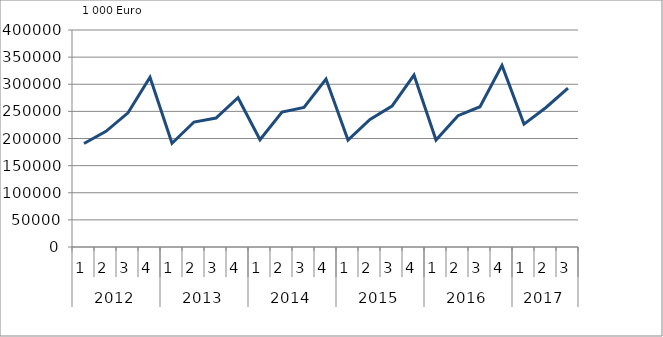
| Category | Ausbaugewerblicher Umsatz3 |
|---|---|
| 0 | 190755 |
| 1 | 213167 |
| 2 | 247277 |
| 3 | 312946 |
| 4 | 191088.978 |
| 5 | 230353.875 |
| 6 | 237735.574 |
| 7 | 275098.219 |
| 8 | 197732.754 |
| 9 | 248690.349 |
| 10 | 257339.084 |
| 11 | 309632.186 |
| 12 | 197030.42 |
| 13 | 235094.994 |
| 14 | 259758.438 |
| 15 | 316833.232 |
| 16 | 197219.532 |
| 17 | 242069.899 |
| 18 | 258547.84 |
| 19 | 334764.305 |
| 20 | 226552.317 |
| 21 | 257191.13 |
| 22 | 292853.372 |